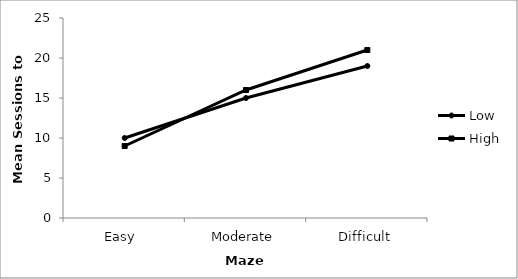
| Category | Low | High |
|---|---|---|
| Easy  | 10 | 9 |
| Moderate | 15 | 16 |
| Difficult | 19 | 21 |